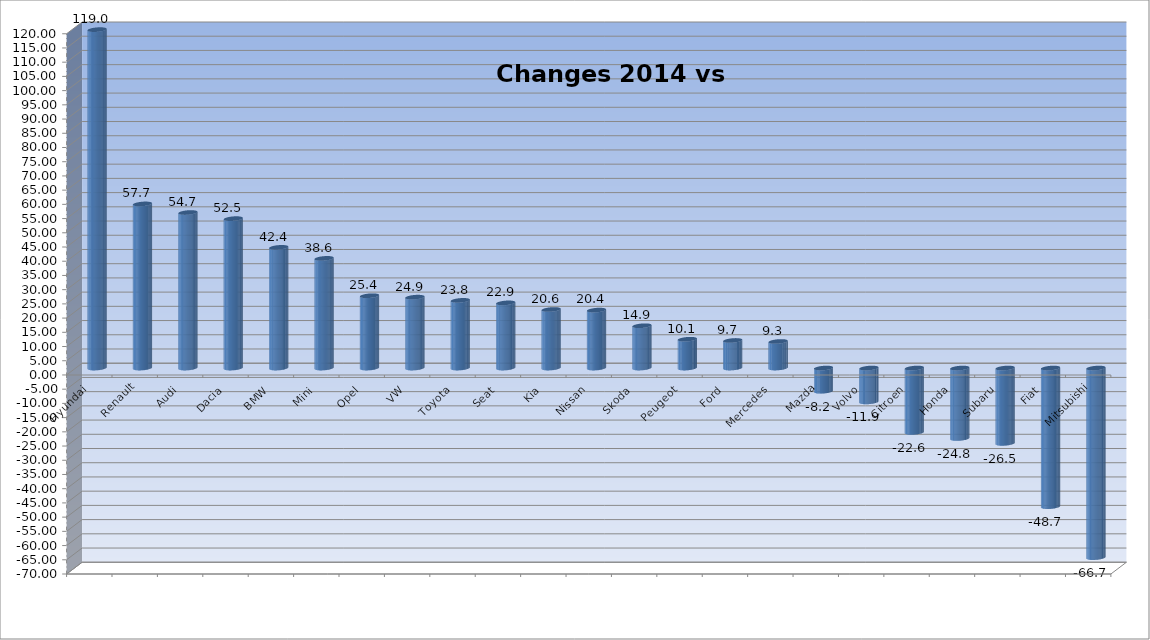
| Category | Ytd 2015 |
|---|---|
| Hyundai | 119.02 |
| Renault | 57.721 |
| Audi | 54.695 |
| Dacia | 52.546 |
| BMW | 42.45 |
| Mini | 38.571 |
| Opel | 25.43 |
| VW | 24.93 |
| Toyota | 23.807 |
| Seat | 22.922 |
| Kia | 20.59 |
| Nissan | 20.378 |
| Skoda | 14.879 |
| Peugeot | 10.135 |
| Ford | 9.699 |
| Mercedes | 9.346 |
| Mazda | -8.159 |
| Volvo | -11.899 |
| Citroen | -22.642 |
| Honda | -24.765 |
| Subaru | -26.494 |
| Fiat | -48.739 |
| Mitsubishi | -66.667 |